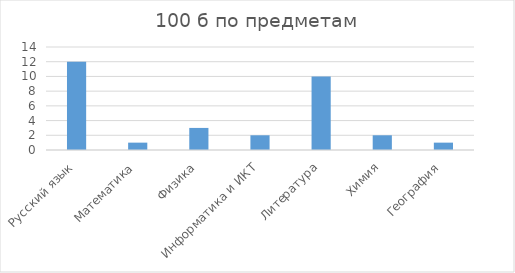
| Category | Series 0 |
|---|---|
| Русский язык | 12 |
| Математика | 1 |
| Физика | 3 |
| Информатика и ИКТ | 2 |
| Литература | 10 |
| Химия | 2 |
| География | 1 |